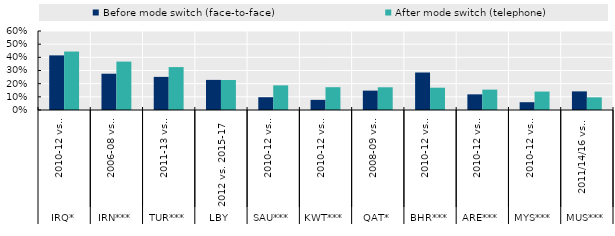
| Category | Before mode switch (face-to-face) | After mode switch (telephone) |
|---|---|---|
| 0 | 0.415 | 0.444 |
| 1 | 0.276 | 0.368 |
| 2 | 0.252 | 0.326 |
| 3 | 0.229 | 0.228 |
| 4 | 0.097 | 0.187 |
| 5 | 0.077 | 0.173 |
| 6 | 0.147 | 0.173 |
| 7 | 0.285 | 0.169 |
| 8 | 0.119 | 0.155 |
| 9 | 0.059 | 0.14 |
| 10 | 0.141 | 0.096 |